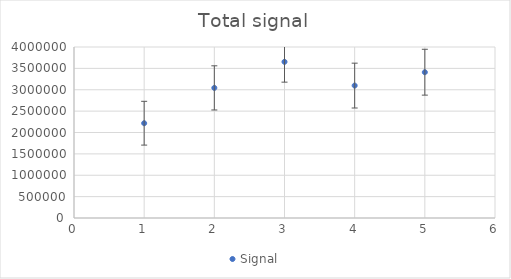
| Category | Signal |
|---|---|
| 0 | 2217156.015 |
| 1 | 3043558.136 |
| 2 | 3653110.143 |
| 3 | 3097482.926 |
| 4 | 3410385.21 |